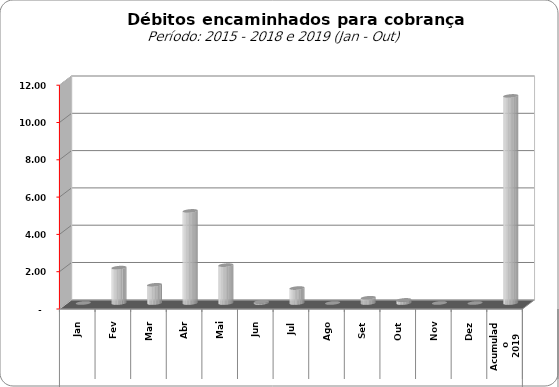
| Category |  3.309.443,02   3.859.728,44   11.181.928,25   7.600.526,01   31.248.623,50   9.830.198,34   20.083.556,95   23.931.734,08   -     1.897.202,11   974.309,37   4.937.737,42   2.030.400,14   66.339,49   799.707,68   -     280.398,44   165.655,52   -     -   |
|---|---|
| 0 | 0 |
| 1 | 1897202.11 |
| 2 | 974309.37 |
| 3 | 4937737.42 |
| 4 | 2030400.14 |
| 5 | 66339.49 |
| 6 | 799707.68 |
| 7 | 0 |
| 8 | 280398.44 |
| 9 | 165655.52 |
| 10 | 0 |
| 11 | 0 |
| 12 | 11103290.41 |